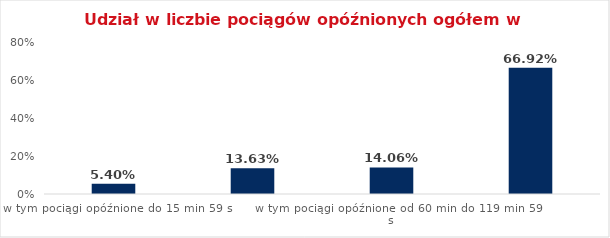
| Category | Series 0 |
|---|---|
| w tym pociągi opóźnione do 15 min 59 s | 0.054 |
| w tym pociągi opóźnione od 16 min do 59 min 59 s | 0.136 |
| w tym pociągi opóźnione od 60 min do 119 min 59 s | 0.141 |
| w tym pociągi opóźnione od 120 min | 0.669 |